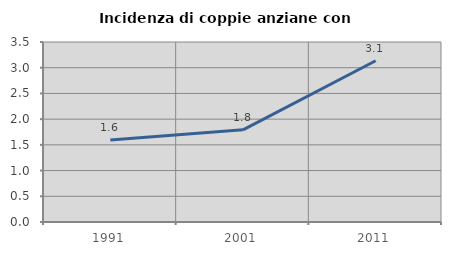
| Category | Incidenza di coppie anziane con figli |
|---|---|
| 1991.0 | 1.595 |
| 2001.0 | 1.792 |
| 2011.0 | 3.136 |